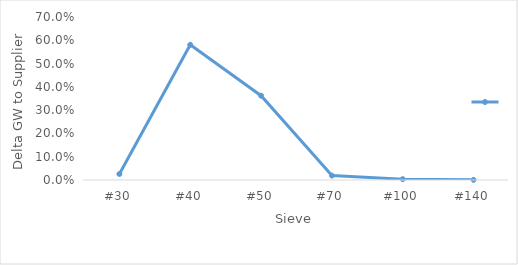
| Category | Series 0 |
|---|---|
| #30 | 0.026 |
| #40 | 0.581 |
| #50 | 0.362 |
| #70 | 0.019 |
| #100 | 0.003 |
| #140 | 0.001 |